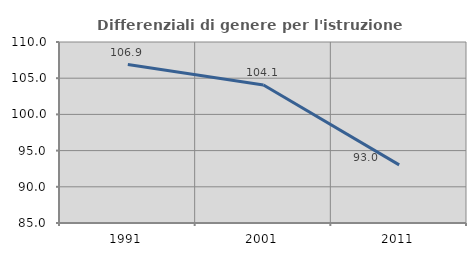
| Category | Differenziali di genere per l'istruzione superiore |
|---|---|
| 1991.0 | 106.892 |
| 2001.0 | 104.071 |
| 2011.0 | 93.031 |